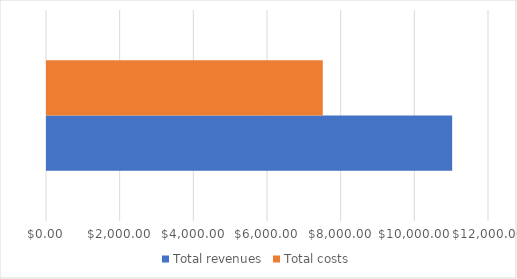
| Category | Total revenues | Total costs |
|---|---|---|
| 0 | 11000 | 7487.05 |